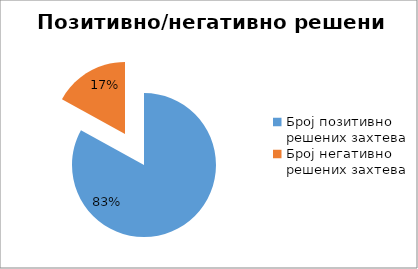
| Category | Series 0 |
|---|---|
| Број позитивно решених захтева | 19566 |
| Број негативно решених захтева | 3999 |